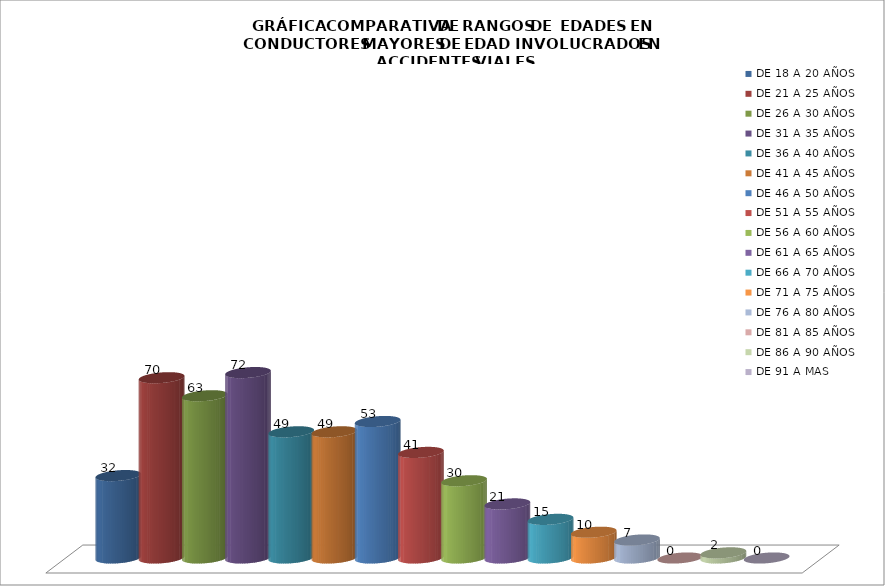
| Category | DE 18 A 20 AÑOS | DE 21 A 25 AÑOS | DE 26 A 30 AÑOS | DE 31 A 35 AÑOS | DE 36 A 40 AÑOS | DE 41 A 45 AÑOS | DE 46 A 50 AÑOS | DE 51 A 55 AÑOS | DE 56 A 60 AÑOS | DE 61 A 65 AÑOS | DE 66 A 70 AÑOS | DE 71 A 75 AÑOS | DE 76 A 80 AÑOS | DE 81 A 85 AÑOS | DE 86 A 90 AÑOS | DE 91 A MAS |
|---|---|---|---|---|---|---|---|---|---|---|---|---|---|---|---|---|
| 0 | 32 | 70 | 63 | 72 | 49 | 49 | 53 | 41 | 30 | 21 | 15 | 10 | 7 | 0 | 2 | 0 |